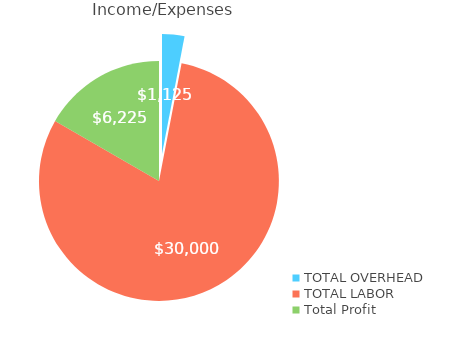
| Category | Series 0 |
|---|---|
| Total Overhead | 1125 |
| Total Labor | 30000 |
| Total Profit | 6225 |